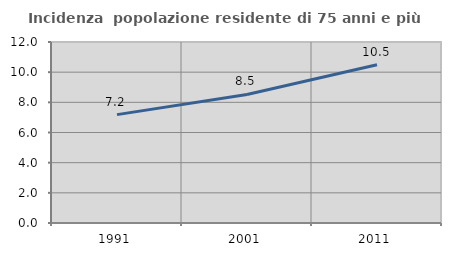
| Category | Incidenza  popolazione residente di 75 anni e più |
|---|---|
| 1991.0 | 7.185 |
| 2001.0 | 8.522 |
| 2011.0 | 10.489 |